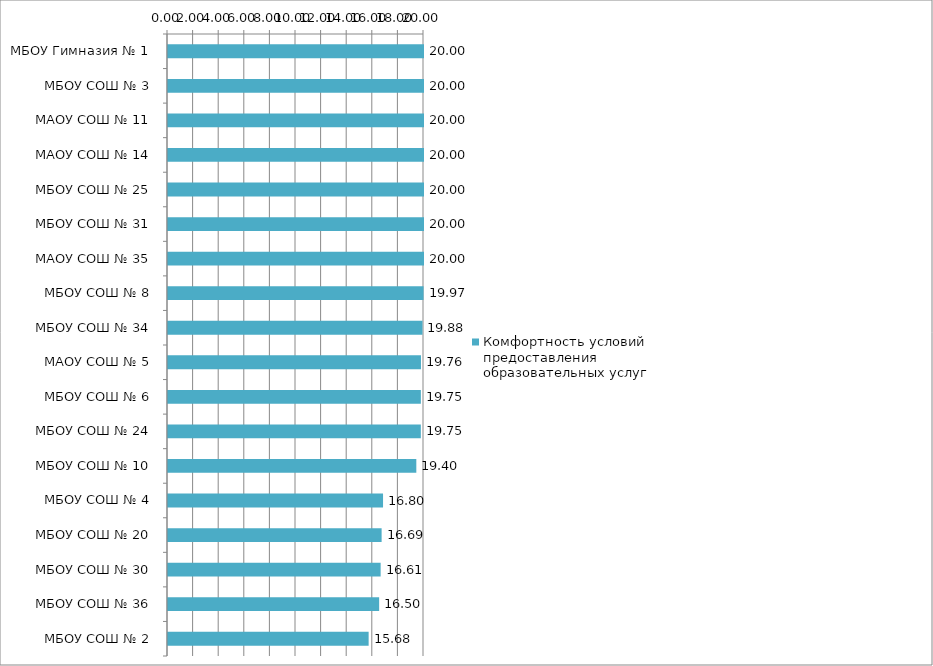
| Category | Комфортность условий предоставления образовательных услуг |
|---|---|
| МБОУ Гимназия № 1 | 20 |
| МБОУ СОШ № 3 | 20 |
| МАОУ СОШ № 11 | 20 |
| МАОУ СОШ № 14 | 20 |
| МБОУ СОШ № 25 | 20 |
| МБОУ СОШ № 31 | 20 |
| МАОУ СОШ № 35 | 20 |
| МБОУ СОШ № 8 | 19.965 |
| МБОУ СОШ № 34 | 19.88 |
| МАОУ СОШ № 5 | 19.763 |
| МБОУ СОШ № 6 | 19.754 |
| МБОУ СОШ № 24 | 19.752 |
| МБОУ СОШ № 10 | 19.4 |
| МБОУ СОШ № 4 | 16.8 |
| МБОУ СОШ № 20 | 16.689 |
| МБОУ СОШ № 30 | 16.612 |
| МБОУ СОШ № 36 | 16.496 |
| МБОУ СОШ № 2 | 15.675 |